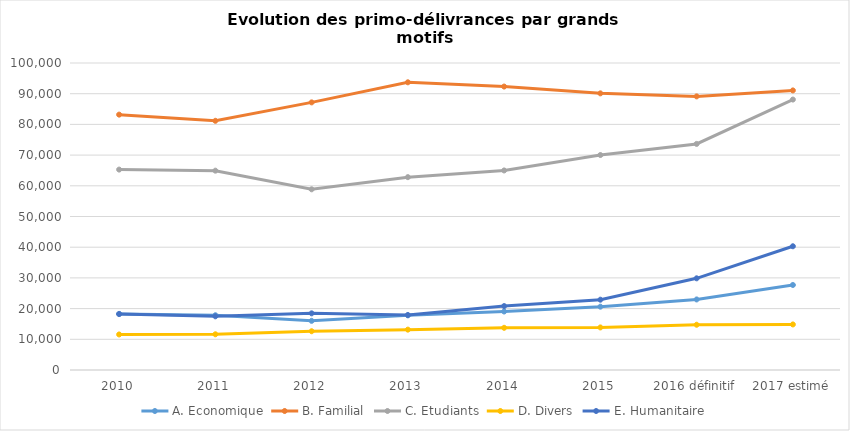
| Category | A. Economique | B. Familial | C. Etudiants | D. Divers | E. Humanitaire |
|---|---|---|---|---|---|
| 2010 | 18280 | 83182 | 65281 | 11572 | 18220 |
| 2011 | 17834 | 81172 | 64928 | 11633 | 17487 |
| 2012 | 16013 | 87170 | 58857 | 12624 | 18456 |
| 2013 | 17800 | 93714 | 62815 | 13148 | 17916 |
| 2014 | 19054 | 92326 | 64996 | 13742 | 20822 |
| 2015 | 20628 | 90113 | 70023 | 13866 | 22903 |
| 2016 définitif | 22982 | 89124 | 73644 | 14741 | 29862 |
| 2017 estimé | 27690 | 91070 | 88095 | 14840 | 40305 |